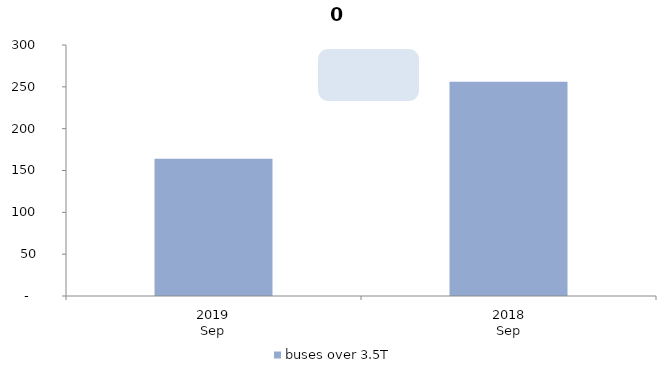
| Category | buses over 3.5T |
|---|---|
| 2019
Sep | 164 |
| 2018
Sep | 256 |